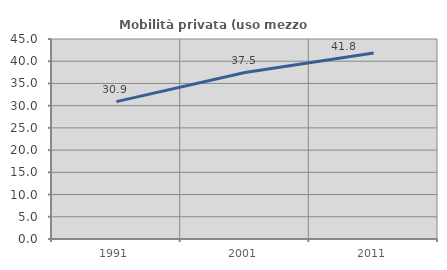
| Category | Mobilità privata (uso mezzo privato) |
|---|---|
| 1991.0 | 30.909 |
| 2001.0 | 37.459 |
| 2011.0 | 41.834 |